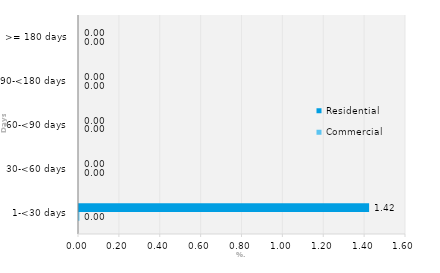
| Category | Commercial | Residential |
|---|---|---|
| 1-<30 days | 0.002 | 1.419 |
| 30-<60 days | 0 | 0 |
| 60-<90 days | 0 | 0 |
| 90-<180 days | 0 | 0 |
| >= 180 days | 0 | 0 |